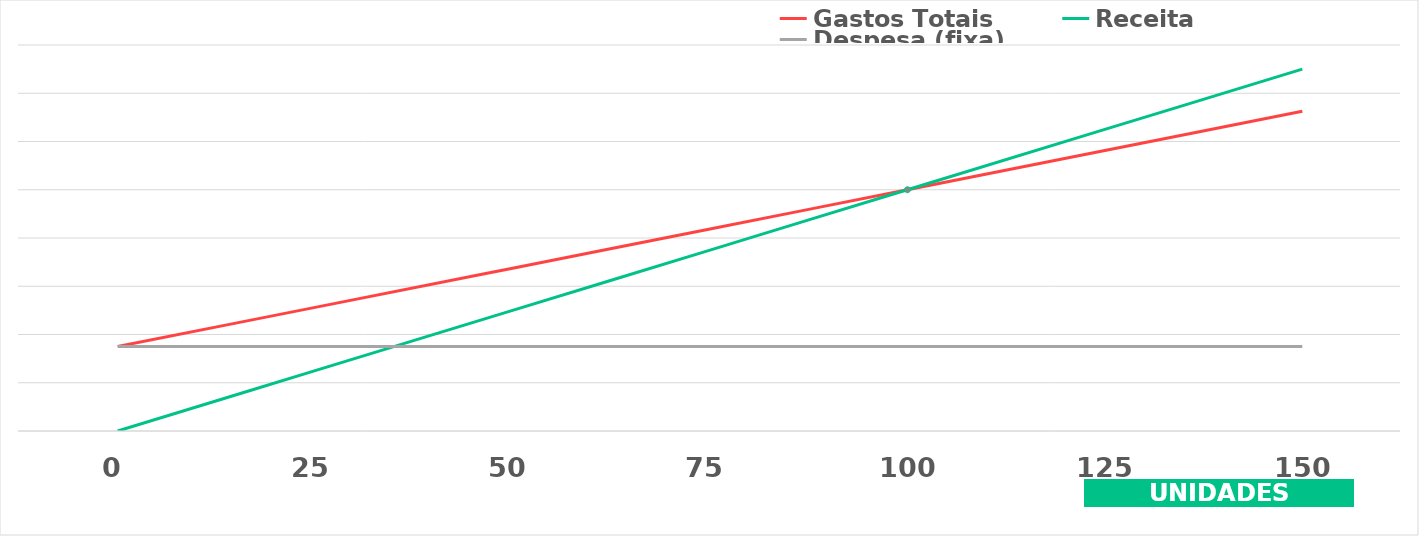
| Category | Gastos Totais | Receita | Despesa (fixa) |
|---|---|---|---|
| 0.0 | 3500 | 0 | 3500 |
| 25.0 | 5125 | 2500 | 3500 |
| 50.0 | 6750 | 5000 | 3500 |
| 75.0 | 8375 | 7500 | 3500 |
| 100.0 | 10000 | 10000 | 3500 |
| 125.0 | 11625 | 12500 | 3500 |
| 150.0 | 13250 | 15000 | 3500 |